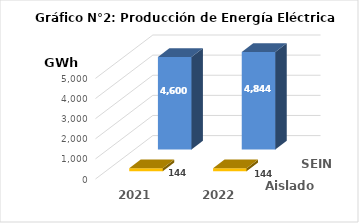
| Category | Aislados | SEIN |
|---|---|---|
| 2021.0 | 143.714 | 4599.899 |
| 2022.0 | 144.282 | 4843.66 |